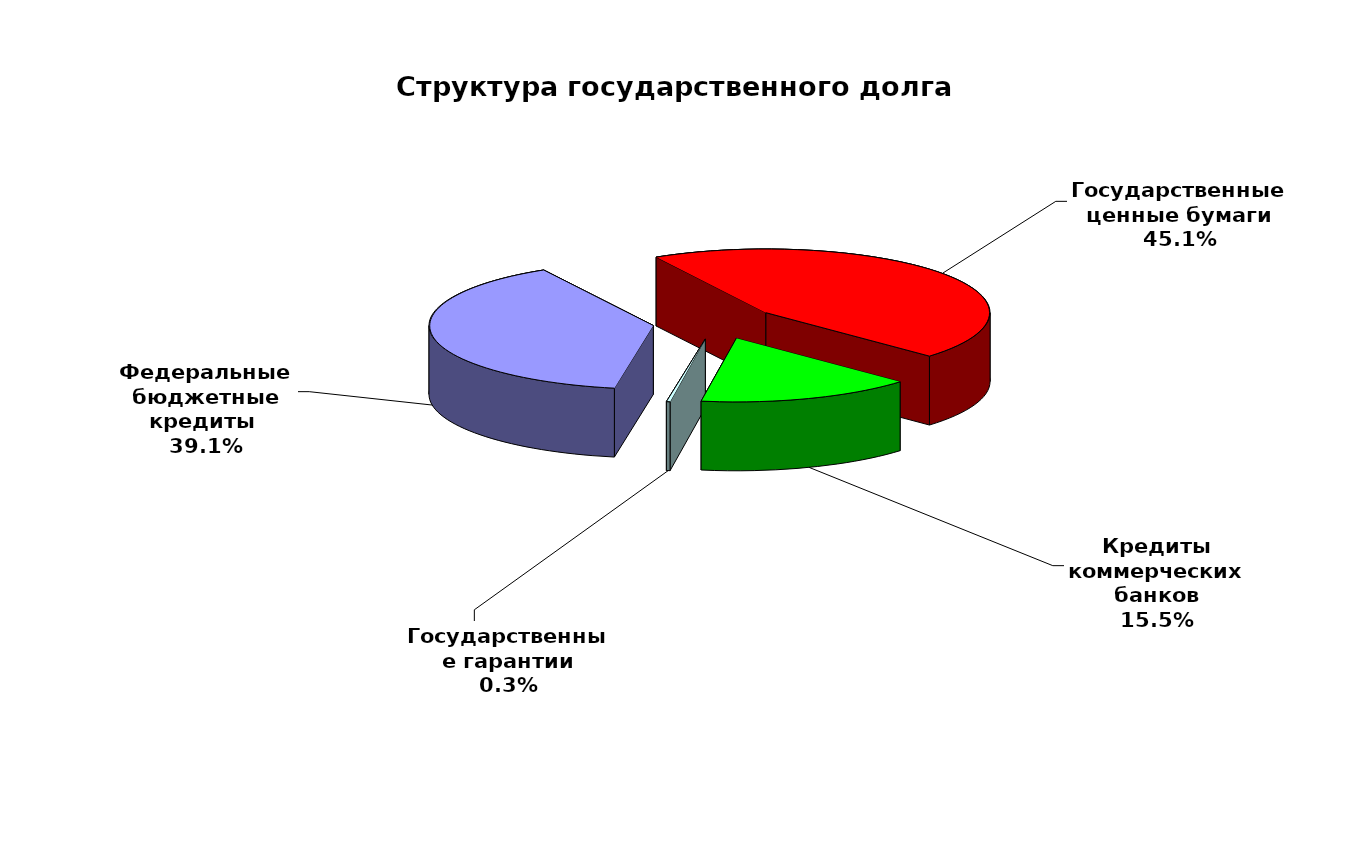
| Category | Series 0 |
|---|---|
| Федеральные бюджетные кредиты  | 27303300.463 |
| Государственные ценные бумаги | 31500000 |
| Кредиты коммерческих банков | 10848333 |
| Государственные гарантии | 184738.15 |